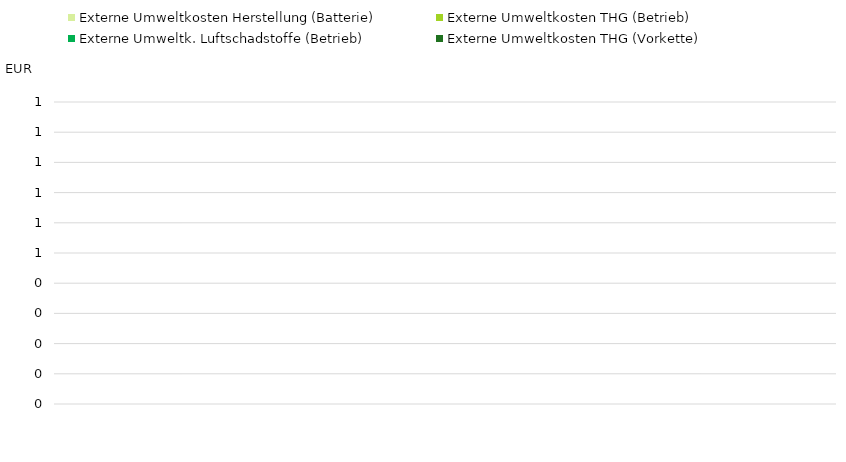
| Category | Externe Umweltkosten Herstellung (Batterie) | Externe Umweltkosten THG (Betrieb) | Externe Umweltk. Luftschadstoffe (Betrieb) | Externe Umweltkosten THG (Vorkette) |
|---|---|---|---|---|
|     | 0 | 0 | 0 | 0 |
|     | 0 | 0 | 0 | 0 |
|     | 0 | 0 | 0 | 0 |
|     | 0 | 0 | 0 | 0 |
|     | 0 | 0 | 0 | 0 |